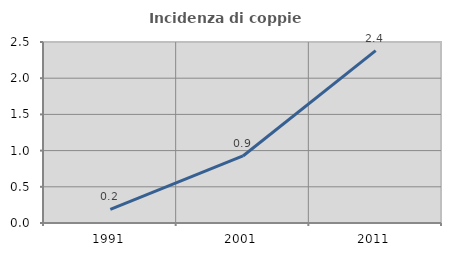
| Category | Incidenza di coppie miste |
|---|---|
| 1991.0 | 0.189 |
| 2001.0 | 0.926 |
| 2011.0 | 2.381 |